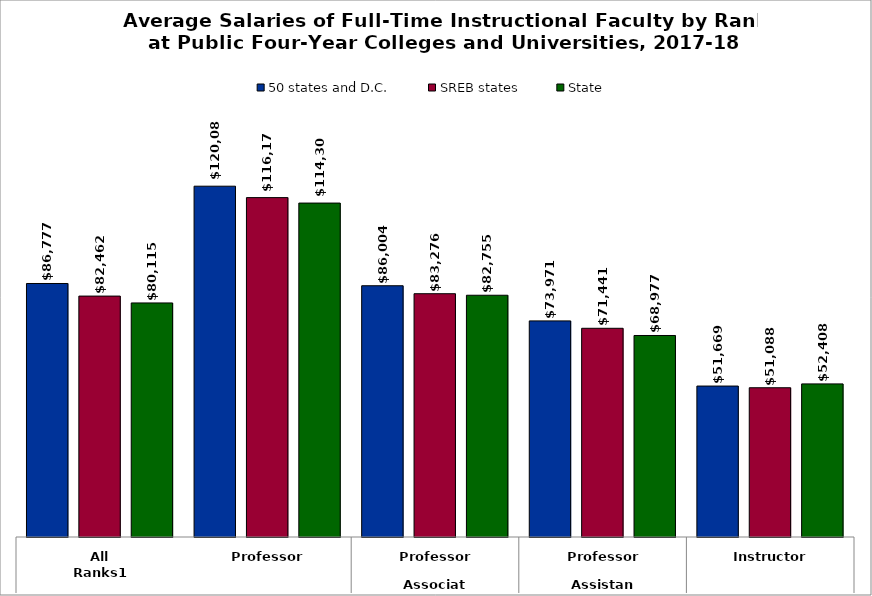
| Category | 50 states and D.C. | SREB states | State |
|---|---|---|---|
| 0 | 86776.755 | 82462.191 | 80115.259 |
| 1 | 120081.538 | 116169.935 | 114301.867 |
| 2 | 86003.521 | 83275.55 | 82755.208 |
| 3 | 73971.463 | 71441.088 | 68976.886 |
| 4 | 51668.55 | 51088.165 | 52407.72 |